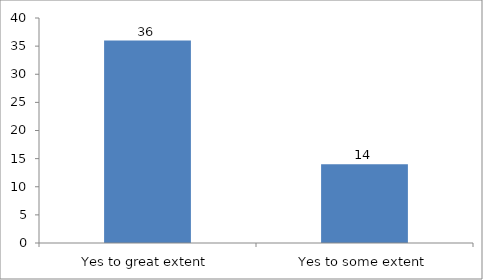
| Category | Are you inspired to become a changemaker?   |
|---|---|
| Yes to great extent | 36 |
| Yes to some extent | 14 |